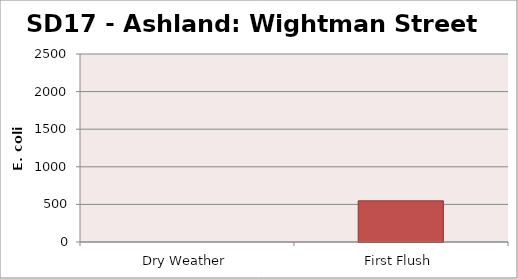
| Category | E. coli MPN |
|---|---|
| Dry Weather | 0 |
| First Flush | 547.5 |